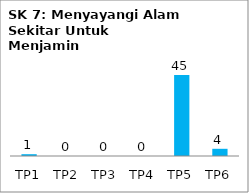
| Category | Bil Pel |
|---|---|
| TP1 | 1 |
| TP2 | 0 |
| TP3 | 0 |
| TP4 | 0 |
| TP5 | 45 |
| TP6 | 4 |